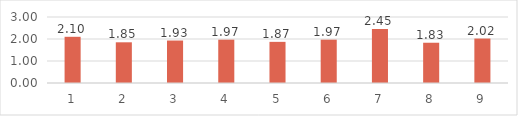
| Category | Series 0 |
|---|---|
| 0 | 2.1 |
| 1 | 1.85 |
| 2 | 1.93 |
| 3 | 1.97 |
| 4 | 1.87 |
| 5 | 1.97 |
| 6 | 2.45 |
| 7 | 1.83 |
| 8 | 2.02 |